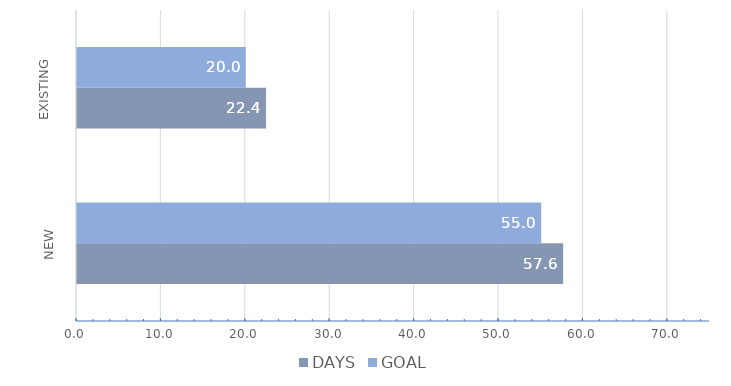
| Category | DAYS | GOAL |
|---|---|---|
| NEW | 57.6 | 55 |
| EXISTING | 22.4 | 20 |